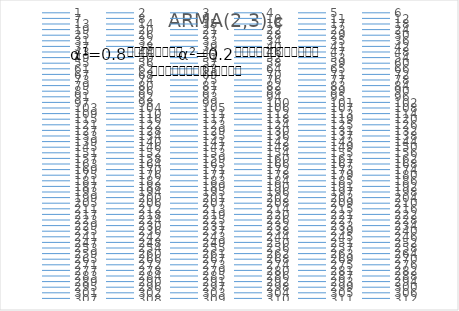
| Category | ARMA(2,3) c |
|---|---|
| 0 | 0 |
| 1 | 7.794 |
| 2 | 12.601 |
| 3 | 18.733 |
| 4 | 23.653 |
| 5 | 29.328 |
| 6 | 37.374 |
| 7 | 45.01 |
| 8 | 52.6 |
| 9 | 62.523 |
| 10 | 72.533 |
| 11 | 80.746 |
| 12 | 90.963 |
| 13 | 101.676 |
| 14 | 111.381 |
| 15 | 121.68 |
| 16 | 132.714 |
| 17 | 142.179 |
| 18 | 151.362 |
| 19 | 161.197 |
| 20 | 170.115 |
| 21 | 179.377 |
| 22 | 188.43 |
| 23 | 196.779 |
| 24 | 204.975 |
| 25 | 213.787 |
| 26 | 222.022 |
| 27 | 229.128 |
| 28 | 236.807 |
| 29 | 243.957 |
| 30 | 252.028 |
| 31 | 260.049 |
| 32 | 266.542 |
| 33 | 272.554 |
| 34 | 279.937 |
| 35 | 288.885 |
| 36 | 298.269 |
| 37 | 308.187 |
| 38 | 319.199 |
| 39 | 328.827 |
| 40 | 336.477 |
| 41 | 344.407 |
| 42 | 352.909 |
| 43 | 359.227 |
| 44 | 367.6 |
| 45 | 376.009 |
| 46 | 384.412 |
| 47 | 392.444 |
| 48 | 402.515 |
| 49 | 411.229 |
| 50 | 420.773 |
| 51 | 430.388 |
| 52 | 438.862 |
| 53 | 445.607 |
| 54 | 453.795 |
| 55 | 461.618 |
| 56 | 469.156 |
| 57 | 477.796 |
| 58 | 485.867 |
| 59 | 494.407 |
| 60 | 501.018 |
| 61 | 508.595 |
| 62 | 515.379 |
| 63 | 520.825 |
| 64 | 528.72 |
| 65 | 534.388 |
| 66 | 543.261 |
| 67 | 550.073 |
| 68 | 556.949 |
| 69 | 565.853 |
| 70 | 572.964 |
| 71 | 581.36 |
| 72 | 588.774 |
| 73 | 596.686 |
| 74 | 605.527 |
| 75 | 614.292 |
| 76 | 623.915 |
| 77 | 632.449 |
| 78 | 641.737 |
| 79 | 650.06 |
| 80 | 659.213 |
| 81 | 667.846 |
| 82 | 675.841 |
| 83 | 684.667 |
| 84 | 693.574 |
| 85 | 702.332 |
| 86 | 711.662 |
| 87 | 719.465 |
| 88 | 728.217 |
| 89 | 735.802 |
| 90 | 743.718 |
| 91 | 749.295 |
| 92 | 757.937 |
| 93 | 766.368 |
| 94 | 773.662 |
| 95 | 782.449 |
| 96 | 789.568 |
| 97 | 797.426 |
| 98 | 805.425 |
| 99 | 816.614 |
| 100 | 824.238 |
| 101 | 832.568 |
| 102 | 840.004 |
| 103 | 846.75 |
| 104 | 853.463 |
| 105 | 859.262 |
| 106 | 865.413 |
| 107 | 872.958 |
| 108 | 879.856 |
| 109 | 886.962 |
| 110 | 893.025 |
| 111 | 899.246 |
| 112 | 904.925 |
| 113 | 912.538 |
| 114 | 920.582 |
| 115 | 926.844 |
| 116 | 935.211 |
| 117 | 941.237 |
| 118 | 949.677 |
| 119 | 957.937 |
| 120 | 965.973 |
| 121 | 975.683 |
| 122 | 984.249 |
| 123 | 993.535 |
| 124 | 1003.337 |
| 125 | 1011.08 |
| 126 | 1021.522 |
| 127 | 1028.278 |
| 128 | 1034.575 |
| 129 | 1040.57 |
| 130 | 1047.314 |
| 131 | 1055.43 |
| 132 | 1063.108 |
| 133 | 1071.02 |
| 134 | 1079.031 |
| 135 | 1086.265 |
| 136 | 1094.112 |
| 137 | 1103.117 |
| 138 | 1110.549 |
| 139 | 1118.759 |
| 140 | 1128.547 |
| 141 | 1138.72 |
| 142 | 1148.203 |
| 143 | 1157.971 |
| 144 | 1168.11 |
| 145 | 1173.533 |
| 146 | 1180.966 |
| 147 | 1190.188 |
| 148 | 1196.454 |
| 149 | 1205.262 |
| 150 | 1214.131 |
| 151 | 1221.572 |
| 152 | 1230.993 |
| 153 | 1240.747 |
| 154 | 1249.177 |
| 155 | 1257.506 |
| 156 | 1263.67 |
| 157 | 1270.51 |
| 158 | 1277.559 |
| 159 | 1283.624 |
| 160 | 1291.181 |
| 161 | 1299.057 |
| 162 | 1307.351 |
| 163 | 1315.326 |
| 164 | 1324.435 |
| 165 | 1332.893 |
| 166 | 1341.736 |
| 167 | 1351.562 |
| 168 | 1360.857 |
| 169 | 1369.188 |
| 170 | 1378.358 |
| 171 | 1386.445 |
| 172 | 1396.262 |
| 173 | 1405.72 |
| 174 | 1413.58 |
| 175 | 1421.557 |
| 176 | 1430.134 |
| 177 | 1436.083 |
| 178 | 1444.75 |
| 179 | 1452.918 |
| 180 | 1459.514 |
| 181 | 1466.225 |
| 182 | 1470.861 |
| 183 | 1478.018 |
| 184 | 1483.14 |
| 185 | 1489.858 |
| 186 | 1497.757 |
| 187 | 1503.821 |
| 188 | 1510.62 |
| 189 | 1518.248 |
| 190 | 1525.138 |
| 191 | 1531.797 |
| 192 | 1538.245 |
| 193 | 1543.066 |
| 194 | 1549.951 |
| 195 | 1557.026 |
| 196 | 1564.754 |
| 197 | 1572.328 |
| 198 | 1581.99 |
| 199 | 1588.819 |
| 200 | 1595.659 |
| 201 | 1604.074 |
| 202 | 1611.64 |
| 203 | 1618.747 |
| 204 | 1625.467 |
| 205 | 1633.339 |
| 206 | 1641.205 |
| 207 | 1649.796 |
| 208 | 1659.224 |
| 209 | 1669.132 |
| 210 | 1677.744 |
| 211 | 1687.182 |
| 212 | 1695.954 |
| 213 | 1703.169 |
| 214 | 1711.275 |
| 215 | 1718.992 |
| 216 | 1725.567 |
| 217 | 1733.754 |
| 218 | 1743.279 |
| 219 | 1750.237 |
| 220 | 1759.514 |
| 221 | 1768.797 |
| 222 | 1775.718 |
| 223 | 1784.033 |
| 224 | 1792.386 |
| 225 | 1799.917 |
| 226 | 1807.795 |
| 227 | 1816.65 |
| 228 | 1824.261 |
| 229 | 1833.515 |
| 230 | 1840.013 |
| 231 | 1846.462 |
| 232 | 1852.41 |
| 233 | 1859.985 |
| 234 | 1868.564 |
| 235 | 1878.65 |
| 236 | 1889.104 |
| 237 | 1899.298 |
| 238 | 1908.341 |
| 239 | 1915.82 |
| 240 | 1926.503 |
| 241 | 1935.18 |
| 242 | 1944.649 |
| 243 | 1952.012 |
| 244 | 1961.65 |
| 245 | 1969.855 |
| 246 | 1978.983 |
| 247 | 1989.168 |
| 248 | 1999.082 |
| 249 | 2007.56 |
| 250 | 2018.523 |
| 251 | 2027.462 |
| 252 | 2038.248 |
| 253 | 2046.65 |
| 254 | 2054.136 |
| 255 | 2061.253 |
| 256 | 2067.675 |
| 257 | 2074.78 |
| 258 | 2082.398 |
| 259 | 2089.305 |
| 260 | 2096.684 |
| 261 | 2105.44 |
| 262 | 2112.928 |
| 263 | 2122.603 |
| 264 | 2131.183 |
| 265 | 2139.323 |
| 266 | 2147.15 |
| 267 | 2156.143 |
| 268 | 2163.39 |
| 269 | 2169.651 |
| 270 | 2176.922 |
| 271 | 2183.934 |
| 272 | 2191.527 |
| 273 | 2200.252 |
| 274 | 2210.151 |
| 275 | 2219.177 |
| 276 | 2228.815 |
| 277 | 2238.68 |
| 278 | 2247.478 |
| 279 | 2255.245 |
| 280 | 2263.92 |
| 281 | 2270.95 |
| 282 | 2280.296 |
| 283 | 2288.045 |
| 284 | 2295.203 |
| 285 | 2303.37 |
| 286 | 2311.81 |
| 287 | 2320.323 |
| 288 | 2329.265 |
| 289 | 2338.993 |
| 290 | 2347.619 |
| 291 | 2357.082 |
| 292 | 2365.55 |
| 293 | 2373.377 |
| 294 | 2379.338 |
| 295 | 2385.715 |
| 296 | 2393.414 |
| 297 | 2401.404 |
| 298 | 2409.324 |
| 299 | 2417.279 |
| 300 | 2423.511 |
| 301 | 2428.197 |
| 302 | 2434.615 |
| 303 | 2439.74 |
| 304 | 2446.228 |
| 305 | 2453.275 |
| 306 | 2461.103 |
| 307 | 2469.158 |
| 308 | 2476.884 |
| 309 | 2484.731 |
| 310 | 2493.708 |
| 311 | 2502.234 |
| 312 | 2511.799 |
| 313 | 2521.194 |
| 314 | 2530.41 |
| 315 | 2540.663 |
| 316 | 2550.619 |
| 317 | 2558.914 |
| 318 | 2568.793 |
| 319 | 2577.756 |
| 320 | 2586.69 |
| 321 | 2596.606 |
| 322 | 2605.856 |
| 323 | 2614.614 |
| 324 | 2622.691 |
| 325 | 2629.952 |
| 326 | 2638.247 |
| 327 | 2647.223 |
| 328 | 2655.972 |
| 329 | 2665.997 |
| 330 | 2674.184 |
| 331 | 2683.173 |
| 332 | 2690.722 |
| 333 | 2698.906 |
| 334 | 2705.634 |
| 335 | 2711.568 |
| 336 | 2719.026 |
| 337 | 2726.359 |
| 338 | 2733.287 |
| 339 | 2742.14 |
| 340 | 2751.043 |
| 341 | 2757.683 |
| 342 | 2764.402 |
| 343 | 2772.334 |
| 344 | 2779.015 |
| 345 | 2786.395 |
| 346 | 2793.841 |
| 347 | 2803.211 |
| 348 | 2812.583 |
| 349 | 2822.876 |
| 350 | 2831.975 |
| 351 | 2839.362 |
| 352 | 2848.237 |
| 353 | 2855.219 |
| 354 | 2864.138 |
| 355 | 2873.921 |
| 356 | 2882.523 |
| 357 | 2892.044 |
| 358 | 2901.205 |
| 359 | 2911.197 |
| 360 | 2919.759 |
| 361 | 2929.769 |
| 362 | 2939.858 |
| 363 | 2948.093 |
| 364 | 2955.608 |
| 365 | 2964.602 |
| 366 | 2972.595 |
| 367 | 2979.494 |
| 368 | 2988.131 |
| 369 | 2995.333 |
| 370 | 3002.052 |
| 371 | 3010.981 |
| 372 | 3018.088 |
| 373 | 3026.145 |
| 374 | 3034.573 |
| 375 | 3041.908 |
| 376 | 3049.456 |
| 377 | 3057.339 |
| 378 | 3066.302 |
| 379 | 3074.912 |
| 380 | 3082.731 |
| 381 | 3090.676 |
| 382 | 3097.596 |
| 383 | 3105.503 |
| 384 | 3113.087 |
| 385 | 3121.003 |
| 386 | 3128.866 |
| 387 | 3136.041 |
| 388 | 3144.424 |
| 389 | 3152.336 |
| 390 | 3163.137 |
| 391 | 3173.126 |
| 392 | 3182.332 |
| 393 | 3191.429 |
| 394 | 3200.265 |
| 395 | 3208.022 |
| 396 | 3219.841 |
| 397 | 3229.451 |
| 398 | 3238.014 |
| 399 | 3248.515 |
| 400 | 3257.314 |
| 401 | 3265.721 |
| 402 | 3274.147 |
| 403 | 3281.998 |
| 404 | 3291.699 |
| 405 | 3300.093 |
| 406 | 3309.979 |
| 407 | 3317.749 |
| 408 | 3324.944 |
| 409 | 3333.088 |
| 410 | 3339.094 |
| 411 | 3347.495 |
| 412 | 3355.011 |
| 413 | 3364.285 |
| 414 | 3374.911 |
| 415 | 3383.413 |
| 416 | 3391.827 |
| 417 | 3398.953 |
| 418 | 3405.445 |
| 419 | 3413.063 |
| 420 | 3421.02 |
| 421 | 3430.483 |
| 422 | 3439.352 |
| 423 | 3447.125 |
| 424 | 3456.512 |
| 425 | 3465.216 |
| 426 | 3473.793 |
| 427 | 3485.16 |
| 428 | 3493.347 |
| 429 | 3503.679 |
| 430 | 3510.846 |
| 431 | 3519.763 |
| 432 | 3529.372 |
| 433 | 3536.817 |
| 434 | 3547.883 |
| 435 | 3555.991 |
| 436 | 3562.854 |
| 437 | 3571.416 |
| 438 | 3577.074 |
| 439 | 3585.639 |
| 440 | 3594.437 |
| 441 | 3602.763 |
| 442 | 3611.637 |
| 443 | 3620.904 |
| 444 | 3629.273 |
| 445 | 3638.213 |
| 446 | 3647.921 |
| 447 | 3655.96 |
| 448 | 3664.272 |
| 449 | 3673.746 |
| 450 | 3682.399 |
| 451 | 3691.917 |
| 452 | 3699.73 |
| 453 | 3706.043 |
| 454 | 3713.14 |
| 455 | 3720.729 |
| 456 | 3729.63 |
| 457 | 3739.432 |
| 458 | 3749.82 |
| 459 | 3757.59 |
| 460 | 3763.477 |
| 461 | 3770.637 |
| 462 | 3778.391 |
| 463 | 3787.644 |
| 464 | 3796.397 |
| 465 | 3803.421 |
| 466 | 3811.375 |
| 467 | 3817.948 |
| 468 | 3824.503 |
| 469 | 3831.579 |
| 470 | 3839.118 |
| 471 | 3846.452 |
| 472 | 3853.008 |
| 473 | 3860.915 |
| 474 | 3869.244 |
| 475 | 3877.746 |
| 476 | 3886.254 |
| 477 | 3894.887 |
| 478 | 3901.862 |
| 479 | 3911.591 |
| 480 | 3919.737 |
| 481 | 3928.092 |
| 482 | 3936.857 |
| 483 | 3944.821 |
| 484 | 3952.536 |
| 485 | 3961.246 |
| 486 | 3968.246 |
| 487 | 3975.094 |
| 488 | 3982.864 |
| 489 | 3989.038 |
| 490 | 3996.54 |
| 491 | 4003.344 |
| 492 | 4009.919 |
| 493 | 4016.236 |
| 494 | 4021.884 |
| 495 | 4028.212 |
| 496 | 4035.173 |
| 497 | 4042.997 |
| 498 | 4050.619 |
| 499 | 4059.861 |
| 500 | 4068.156 |
| 501 | 4075.628 |
| 502 | 4084.319 |
| 503 | 4092.103 |
| 504 | 4099.515 |
| 505 | 4107.605 |
| 506 | 4114.673 |
| 507 | 4121.314 |
| 508 | 4127.915 |
| 509 | 4134.459 |
| 510 | 4141.949 |
| 511 | 4150.31 |
| 512 | 4156.864 |
| 513 | 4164.908 |
| 514 | 4172.262 |
| 515 | 4179.956 |
| 516 | 4188.838 |
| 517 | 4196.956 |
| 518 | 4206.372 |
| 519 | 4216.09 |
| 520 | 4223.15 |
| 521 | 4231.487 |
| 522 | 4237.712 |
| 523 | 4244.729 |
| 524 | 4252.967 |
| 525 | 4259.416 |
| 526 | 4268.623 |
| 527 | 4275.422 |
| 528 | 4283.119 |
| 529 | 4291.503 |
| 530 | 4301.441 |
| 531 | 4310.911 |
| 532 | 4321.066 |
| 533 | 4329.299 |
| 534 | 4337.465 |
| 535 | 4345.259 |
| 536 | 4353.83 |
| 537 | 4363.991 |
| 538 | 4374.102 |
| 539 | 4384.538 |
| 540 | 4394.317 |
| 541 | 4402.874 |
| 542 | 4411.947 |
| 543 | 4420.043 |
| 544 | 4429.065 |
| 545 | 4437.468 |
| 546 | 4443.259 |
| 547 | 4449.288 |
| 548 | 4457.286 |
| 549 | 4464.054 |
| 550 | 4472.57 |
| 551 | 4481.521 |
| 552 | 4489.99 |
| 553 | 4498.125 |
| 554 | 4505.651 |
| 555 | 4513.969 |
| 556 | 4519.442 |
| 557 | 4527.005 |
| 558 | 4535.189 |
| 559 | 4542.239 |
| 560 | 4548.573 |
| 561 | 4554.31 |
| 562 | 4559.979 |
| 563 | 4566.344 |
| 564 | 4573.005 |
| 565 | 4580.199 |
| 566 | 4587.907 |
| 567 | 4595.85 |
| 568 | 4601.662 |
| 569 | 4609.812 |
| 570 | 4616.405 |
| 571 | 4623.5 |
| 572 | 4631.023 |
| 573 | 4638.214 |
| 574 | 4644.771 |
| 575 | 4652.659 |
| 576 | 4660.192 |
| 577 | 4668.135 |
| 578 | 4676.785 |
| 579 | 4684.673 |
| 580 | 4693.859 |
| 581 | 4702.46 |
| 582 | 4711.401 |
| 583 | 4719.144 |
| 584 | 4727.164 |
| 585 | 4735.923 |
| 586 | 4744.522 |
| 587 | 4753.001 |
| 588 | 4762.058 |
| 589 | 4770.606 |
| 590 | 4779.411 |
| 591 | 4788.101 |
| 592 | 4796.181 |
| 593 | 4805.637 |
| 594 | 4813.442 |
| 595 | 4822.492 |
| 596 | 4829.537 |
| 597 | 4836.512 |
| 598 | 4844.963 |
| 599 | 4854.175 |
| 600 | 4864.893 |